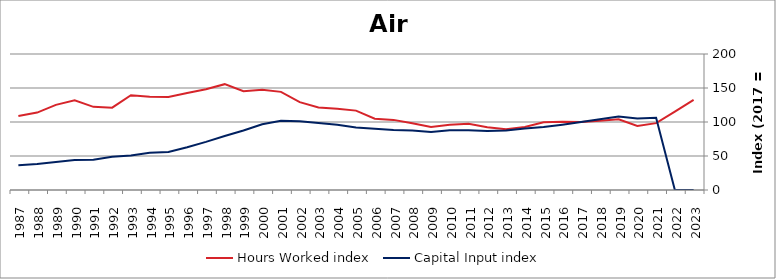
| Category | Hours Worked index | Capital Input index |
|---|---|---|
| 2023.0 | 132.668 | 0 |
| 2022.0 | 115.149 | 0 |
| 2021.0 | 98.359 | 106.248 |
| 2020.0 | 94.195 | 105.055 |
| 2019.0 | 103.907 | 108.031 |
| 2018.0 | 101.873 | 104.092 |
| 2017.0 | 100 | 100 |
| 2016.0 | 100.233 | 96.02 |
| 2015.0 | 99.555 | 92.547 |
| 2014.0 | 92.788 | 90.276 |
| 2013.0 | 89.402 | 87.496 |
| 2012.0 | 92.222 | 86.592 |
| 2011.0 | 97.418 | 87.875 |
| 2010.0 | 96.071 | 87.812 |
| 2009.0 | 92.612 | 85.241 |
| 2008.0 | 98.188 | 87.321 |
| 2007.0 | 103.108 | 88.164 |
| 2006.0 | 104.745 | 90.132 |
| 2005.0 | 116.731 | 91.981 |
| 2004.0 | 119.649 | 96.1 |
| 2003.0 | 121.394 | 98.664 |
| 2002.0 | 129.173 | 100.928 |
| 2001.0 | 144.295 | 101.705 |
| 2000.0 | 147.489 | 96.637 |
| 1999.0 | 145.33 | 87.536 |
| 1998.0 | 155.627 | 79.514 |
| 1997.0 | 148.127 | 70.731 |
| 1996.0 | 142.552 | 62.756 |
| 1995.0 | 136.77 | 56.013 |
| 1994.0 | 137.265 | 54.685 |
| 1993.0 | 139.343 | 50.725 |
| 1992.0 | 121.076 | 48.768 |
| 1991.0 | 122.255 | 44.598 |
| 1990.0 | 131.851 | 43.936 |
| 1989.0 | 125.213 | 41.159 |
| 1988.0 | 113.886 | 38.336 |
| 1987.0 | 108.672 | 36.307 |